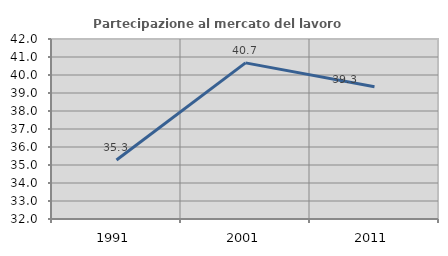
| Category | Partecipazione al mercato del lavoro  femminile |
|---|---|
| 1991.0 | 35.277 |
| 2001.0 | 40.673 |
| 2011.0 | 39.346 |